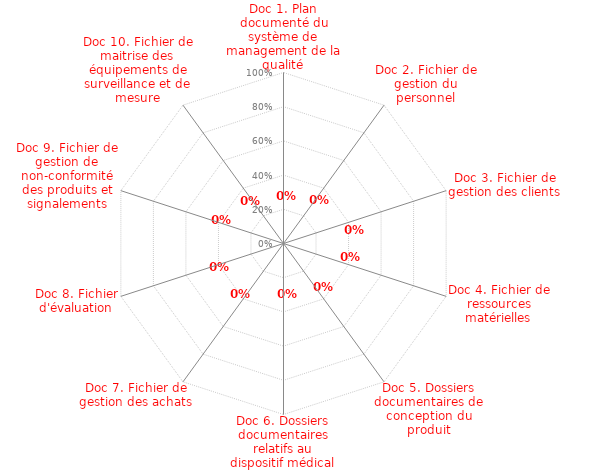
| Category | Résultats |
|---|---|
| Doc 1. Plan documenté du système de management de la qualité | 0 |
| Doc 2. Fichier de gestion du personnel | 0 |
| Doc 3. Fichier de gestion des clients | 0 |
| Doc 4. Fichier de ressources matérielles | 0 |
| Doc 5. Dossiers documentaires de conception du produit | 0 |
| Doc 6. Dossiers documentaires relatifs au dispositif médical | 0 |
| Doc 7. Fichier de gestion des achats | 0 |
| Doc 8. Fichier d'évaluation | 0 |
| Doc 9. Fichier de gestion de non-conformité des produits et signalements | 0 |
| Doc 10. Fichier de maitrise des équipements de surveillance et de mesure | 0 |